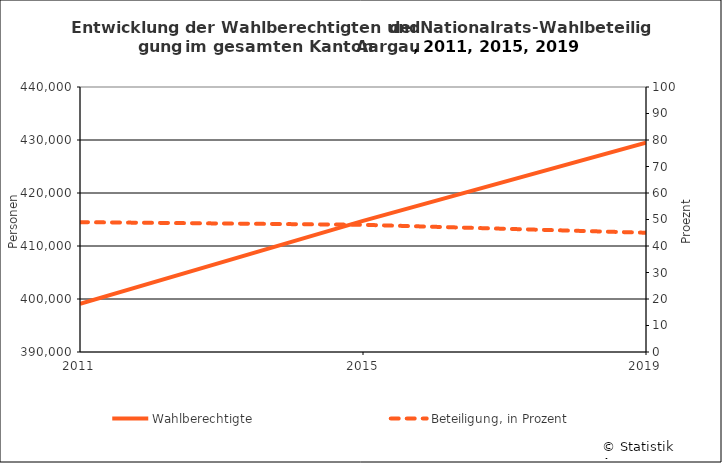
| Category | Wahlberechtigte |
|---|---|
| 2011.0 | 399092 |
| 2015.0 | 414745 |
| 2019.0 | 429516 |